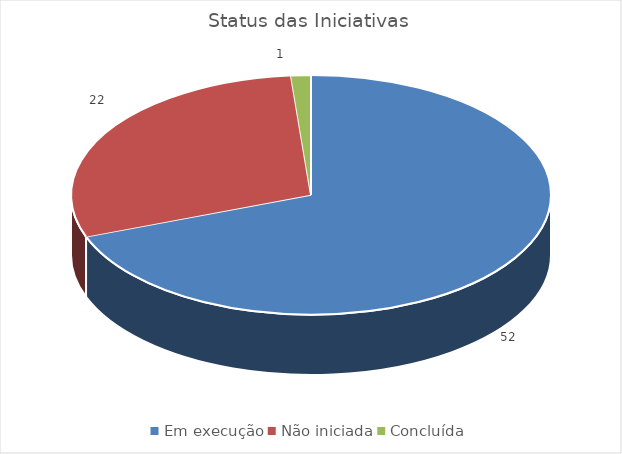
| Category | Series 0 |
|---|---|
| Em execução | 52 |
| Não iniciada | 22 |
| Concluída | 1 |